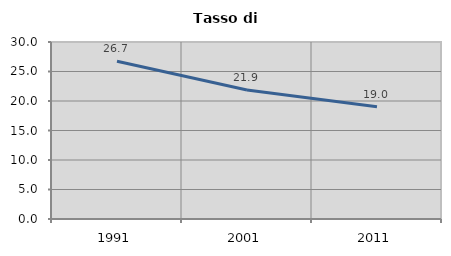
| Category | Tasso di disoccupazione   |
|---|---|
| 1991.0 | 26.749 |
| 2001.0 | 21.875 |
| 2011.0 | 19.011 |